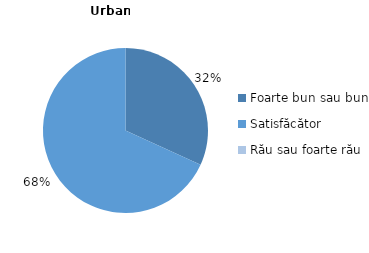
| Category | Series 0 |
|---|---|
| Foarte bun sau bun | 31.805 |
| Satisfăcător | 68.195 |
| Rău sau foarte rău | 0 |